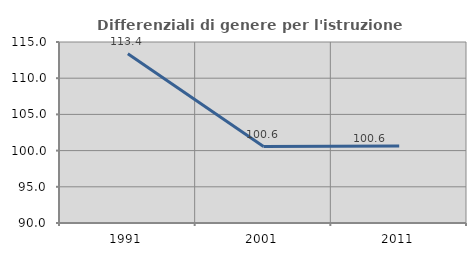
| Category | Differenziali di genere per l'istruzione superiore |
|---|---|
| 1991.0 | 113.384 |
| 2001.0 | 100.555 |
| 2011.0 | 100.645 |